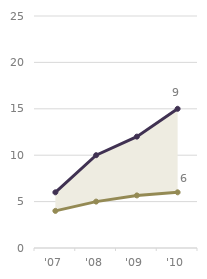
| Category | Bisc | Choc |
|---|---|---|
| '07 | 4 | 2 |
| '08 | 5 | 5 |
| '09 | 5.667 | 6.333 |
| '10 | 6 | 9 |